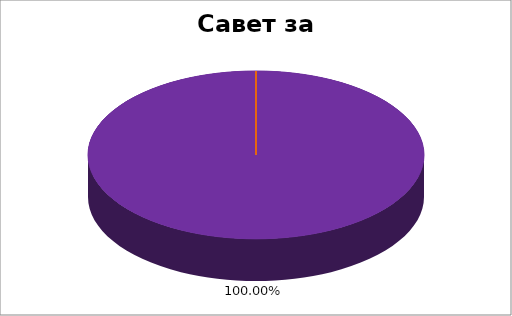
| Category | Савет за штампу |
|---|---|
| 0 | 0 |
| 1 | 0 |
| 2 | 0 |
| 3 | 0 |
| 4 | 1 |